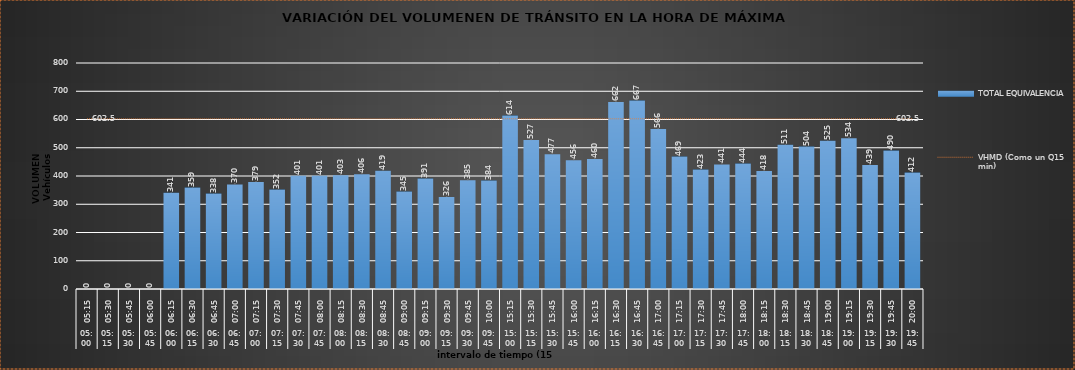
| Category | TOTAL EQUIVALENCIA   |
|---|---|
| 0 | 0 |
| 1 | 0 |
| 2 | 0 |
| 3 | 0 |
| 4 | 341 |
| 5 | 359 |
| 6 | 338 |
| 7 | 370 |
| 8 | 379 |
| 9 | 352 |
| 10 | 401 |
| 11 | 401 |
| 12 | 403 |
| 13 | 406 |
| 14 | 419 |
| 15 | 345 |
| 16 | 391 |
| 17 | 326 |
| 18 | 385 |
| 19 | 384 |
| 20 | 614 |
| 21 | 527 |
| 22 | 477 |
| 23 | 456 |
| 24 | 460 |
| 25 | 662 |
| 26 | 667 |
| 27 | 566 |
| 28 | 469 |
| 29 | 423 |
| 30 | 441 |
| 31 | 444 |
| 32 | 418 |
| 33 | 511 |
| 34 | 504 |
| 35 | 525 |
| 36 | 534 |
| 37 | 439 |
| 38 | 490 |
| 39 | 412 |